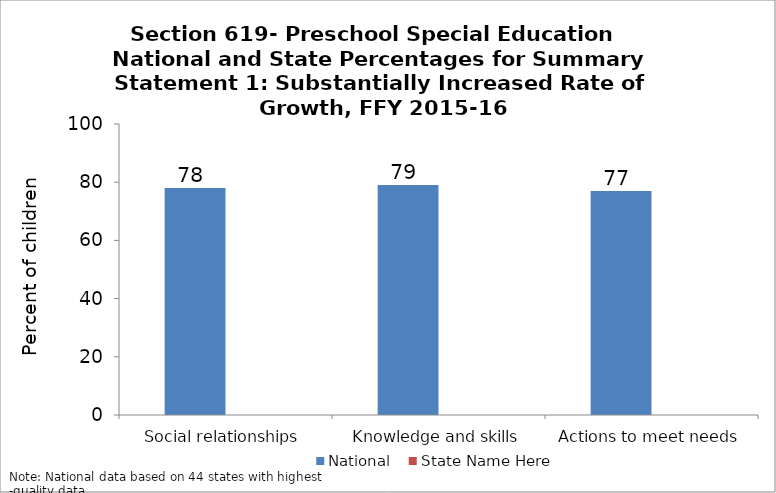
| Category | National | State Name Here |
|---|---|---|
| Social relationships | 78 |  |
| Knowledge and skills | 79 |  |
| Actions to meet needs | 77 |  |